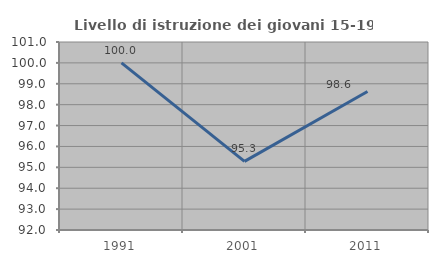
| Category | Livello di istruzione dei giovani 15-19 anni |
|---|---|
| 1991.0 | 100 |
| 2001.0 | 95.283 |
| 2011.0 | 98.63 |